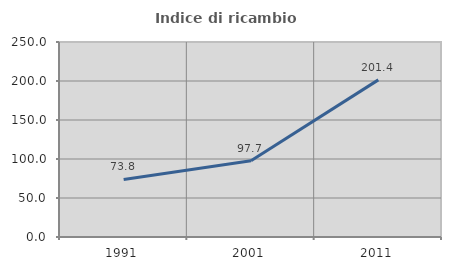
| Category | Indice di ricambio occupazionale  |
|---|---|
| 1991.0 | 73.81 |
| 2001.0 | 97.674 |
| 2011.0 | 201.449 |